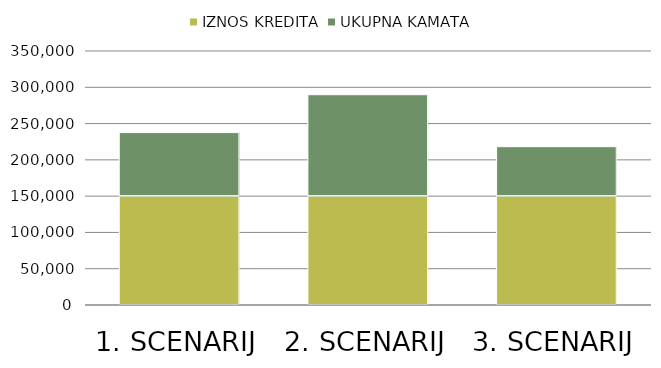
| Category | IZNOS KREDITA | UKUPNA KAMATA |
|---|---|---|
| 1. SCENARIJ | 150000 | 87584.066 |
| 2. SCENARIJ | 150000 | 139753.762 |
| 3. SCENARIJ | 150000 | 68152.919 |